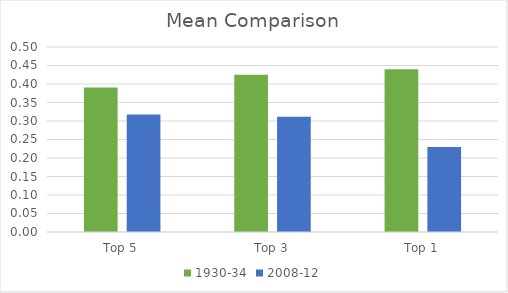
| Category | 1930-34 | 2008-12 |
|---|---|---|
| Top 5 | 0.39 | 0.318 |
| Top 3 | 0.425 | 0.312 |
| Top 1 | 0.44 | 0.23 |